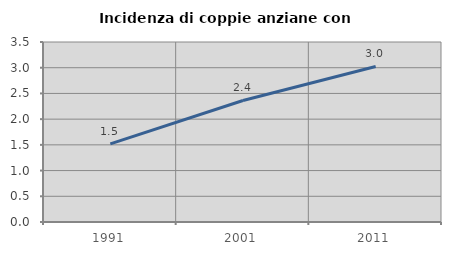
| Category | Incidenza di coppie anziane con figli |
|---|---|
| 1991.0 | 1.518 |
| 2001.0 | 2.363 |
| 2011.0 | 3.024 |